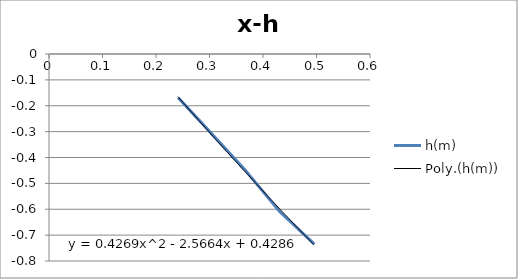
| Category | h(m) |
|---|---|
| 0.241 | -0.168 |
| 0.287 | -0.27 |
| 0.366 | -0.447 |
| 0.431 | -0.609 |
| 0.496 | -0.735 |